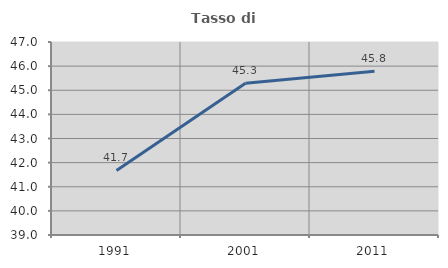
| Category | Tasso di occupazione   |
|---|---|
| 1991.0 | 41.676 |
| 2001.0 | 45.287 |
| 2011.0 | 45.783 |